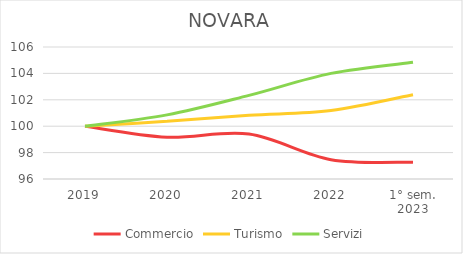
| Category | Commercio | Turismo | Servizi |
|---|---|---|---|
| 2019 | 100 | 100 | 100 |
| 2020 | 99.167 | 100.367 | 100.859 |
| 2021 | 99.406 | 100.825 | 102.336 |
| 2022 | 97.466 | 101.192 | 104.003 |
| 1° sem.
2023 | 97.272 | 102.384 | 104.842 |